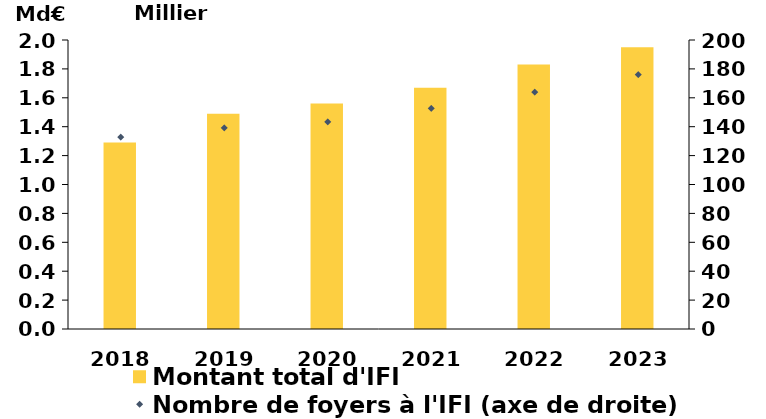
| Category | Montant total d'IFI |
|---|---|
| 2018.0 | 1.29 |
| 2019.0 | 1.49 |
| 2020.0 | 1.56 |
| 2021.0 | 1.67 |
| 2022.0 | 1.83 |
| 2023.0 | 1.95 |